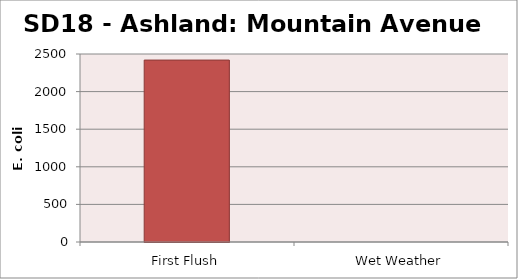
| Category | E. coli MPN - |
|---|---|
| First Flush | 2419.2 |
| Wet Weather | 0 |